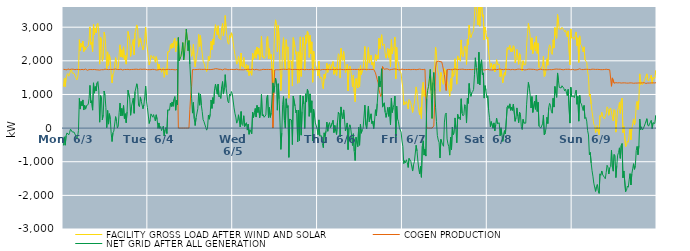
| Category | FACILITY GROSS LOAD AFTER WIND AND SOLAR | COGEN PRODUCTION | NET GRID AFTER ALL GENERATION |
|---|---|---|---|
|  Mon  6/3 | 1231 | 1748 | -517 |
|  Mon  6/3 | 1475 | 1734 | -259 |
|  Mon  6/3 | 1232 | 1740 | -508 |
|  Mon  6/3 | 1501 | 1728 | -227 |
|  Mon  6/3 | 1587 | 1730 | -143 |
|  Mon  6/3 | 1622 | 1760 | -138 |
|  Mon  6/3 | 1544 | 1745 | -201 |
|  Mon  6/3 | 1611 | 1739 | -128 |
|  Mon  6/3 | 1703 | 1734 | -31 |
|  Mon  6/3 | 1740 | 1752 | -12 |
|  Mon  6/3 | 1635 | 1751 | -116 |
|  Mon  6/3 | 1643 | 1750 | -107 |
|  Mon  6/3 | 1629 | 1748 | -119 |
|  Mon  6/3 | 1603 | 1737 | -134 |
|  Mon  6/3 | 1506 | 1740 | -234 |
|  Mon  6/3 | 1429 | 1746 | -317 |
|  Mon  6/3 | 1481 | 1740 | -259 |
|  Mon  6/3 | 1672 | 1744 | -72 |
|  Mon  6/3 | 2629 | 1744 | 885 |
|  Mon  6/3 | 2300 | 1735 | 565 |
|  Mon  6/3 | 2517 | 1725 | 792 |
|  Mon  6/3 | 2406 | 1745 | 661 |
|  Mon  6/3 | 2585 | 1748 | 837 |
|  Mon  6/3 | 2272 | 1735 | 537 |
|  Mon  6/3 | 2419 | 1744 | 675 |
|  Mon  6/3 | 2319 | 1755 | 564 |
|  Mon  6/3 | 2400 | 1734 | 666 |
|  Mon  6/3 | 2386 | 1720 | 666 |
|  Mon  6/3 | 2443 | 1741 | 702 |
|  Mon  6/3 | 2621 | 1739 | 882 |
|  Mon  6/3 | 3010 | 1741 | 1269 |
|  Mon  6/3 | 2487 | 1741 | 746 |
|  Mon  6/3 | 2557 | 1745 | 812 |
|  Mon  6/3 | 2273 | 1739 | 534 |
|  Mon  6/3 | 3085 | 1740 | 1345 |
|  Mon  6/3 | 2781 | 1743 | 1038 |
|  Mon  6/3 | 2978 | 1743 | 1235 |
|  Mon  6/3 | 2836 | 1734 | 1102 |
|  Mon  6/3 | 3083 | 1741 | 1342 |
|  Mon  6/3 | 3115 | 1731 | 1384 |
|  Mon  6/3 | 2851 | 1742 | 1109 |
|  Mon  6/3 | 1900 | 1725 | 175 |
|  Mon  6/3 | 2705 | 1736 | 969 |
|  Mon  6/3 | 2658 | 1737 | 921 |
|  Mon  6/3 | 1989 | 1744 | 245 |
|  Mon  6/3 | 2133 | 1734 | 399 |
|  Mon  6/3 | 2853 | 1751 | 1102 |
|  Mon  6/3 | 2725 | 1753 | 972 |
|  Mon  6/3 | 2364 | 1748 | 616 |
|  Mon  6/3 | 1758 | 1745 | 13 |
|  Mon  6/3 | 2266 | 1743 | 523 |
|  Mon  6/3 | 1857 | 1739 | 118 |
|  Mon  6/3 | 2182 | 1753 | 429 |
|  Mon  6/3 | 2016 | 1744 | 272 |
|  Mon  6/3 | 1598 | 1753 | -155 |
|  Mon  6/3 | 1344 | 1743 | -399 |
|  Mon  6/3 | 1600 | 1741 | -141 |
|  Mon  6/3 | 1657 | 1747 | -90 |
|  Mon  6/3 | 1654 | 1753 | -99 |
|  Mon  6/3 | 2096 | 1756 | 340 |
|  Mon  6/3 | 1939 | 1735 | 204 |
|  Mon  6/3 | 1743 | 1743 | 0 |
|  Mon  6/3 | 1785 | 1723 | 62 |
|  Mon  6/3 | 2194 | 1738 | 456 |
|  Mon  6/3 | 2476 | 1733 | 743 |
|  Mon  6/3 | 2113 | 1753 | 360 |
|  Mon  6/3 | 2329 | 1745 | 584 |
|  Mon  6/3 | 2102 | 1728 | 374 |
|  Mon  6/3 | 2416 | 1746 | 670 |
|  Mon  6/3 | 2026 | 1743 | 283 |
|  Mon  6/3 | 2156 | 1728 | 428 |
|  Mon  6/3 | 1901 | 1742 | 159 |
|  Mon  6/3 | 2227 | 1743 | 484 |
|  Mon  6/3 | 2874 | 1747 | 1127 |
|  Mon  6/3 | 2880 | 1743 | 1137 |
|  Mon  6/3 | 2612 | 1737 | 875 |
|  Mon  6/3 | 2132 | 1751 | 381 |
|  Mon  6/3 | 2391 | 1743 | 648 |
|  Mon  6/3 | 2374 | 1743 | 631 |
|  Mon  6/3 | 2633 | 1744 | 889 |
|  Mon  6/3 | 2177 | 1737 | 440 |
|  Mon  6/3 | 2833 | 1749 | 1084 |
|  Mon  6/3 | 2821 | 1740 | 1081 |
|  Mon  6/3 | 3067 | 1750 | 1317 |
|  Mon  6/3 | 2912 | 1743 | 1169 |
|  Mon  6/3 | 2407 | 1741 | 666 |
|  Mon  6/3 | 2378 | 1742 | 636 |
|  Mon  6/3 | 2681 | 1753 | 928 |
|  Mon  6/3 | 2537 | 1741 | 796 |
|  Mon  6/3 | 2548 | 1746 | 802 |
|  Mon  6/3 | 2321 | 1745 | 576 |
|  Mon  6/3 | 2440 | 1751 | 689 |
|  Mon  6/3 | 2669 | 1740 | 929 |
|  Mon  6/3 | 2997 | 1749 | 1248 |
|  Mon  6/3 | 2534 | 1745 | 789 |
|  Mon  6/3 | 2348 | 1737 | 611 |
|  Tue  6/4 | 2333 | 1742 | 591 |
|  Tue  6/4 | 1876 | 1738 | 138 |
|  Tue  6/4 | 1972 | 1738 | 234 |
|  Tue  6/4 | 2161 | 1738 | 423 |
|  Tue  6/4 | 2145 | 1738 | 407 |
|  Tue  6/4 | 2071 | 1747 | 324 |
|  Tue  6/4 | 2150 | 1748 | 402 |
|  Tue  6/4 | 2037 | 1742 | 295 |
|  Tue  6/4 | 1956 | 1742 | 214 |
|  Tue  6/4 | 2123 | 1728 | 395 |
|  Tue  6/4 | 2005 | 1751 | 254 |
|  Tue  6/4 | 1724 | 1733 | -9 |
|  Tue  6/4 | 1905 | 1752 | 153 |
|  Tue  6/4 | 1735 | 1746 | -11 |
|  Tue  6/4 | 1775 | 1729 | 46 |
|  Tue  6/4 | 1660 | 1735 | -75 |
|  Tue  6/4 | 1743 | 1749 | -6 |
|  Tue  6/4 | 1795 | 1740 | 55 |
|  Tue  6/4 | 1511 | 1743 | -232 |
|  Tue  6/4 | 1684 | 1735 | -51 |
|  Tue  6/4 | 1763 | 1747 | 16 |
|  Tue  6/4 | 1584 | 1745 | -161 |
|  Tue  6/4 | 2268 | 1726 | 542 |
|  Tue  6/4 | 2285 | 1746 | 539 |
|  Tue  6/4 | 2274 | 1742 | 532 |
|  Tue  6/4 | 2481 | 1740 | 741 |
|  Tue  6/4 | 2368 | 1726 | 642 |
|  Tue  6/4 | 2522 | 1745 | 777 |
|  Tue  6/4 | 2383 | 1736 | 647 |
|  Tue  6/4 | 2589 | 1736 | 853 |
|  Tue  6/4 | 2667 | 1731 | 936 |
|  Tue  6/4 | 2263 | 1732 | 531 |
|  Tue  6/4 | 2569 | 1745 | 824 |
|  Tue  6/4 | 2444 | 1748 | 696 |
|  Tue  6/4 | 2691 | 0 | 2691 |
|  Tue  6/4 | 2007 | 0 | 2007 |
|  Tue  6/4 | 2080 | 0 | 2080 |
|  Tue  6/4 | 2136 | 0 | 2136 |
|  Tue  6/4 | 2301 | 0 | 2301 |
|  Tue  6/4 | 2542 | 0 | 2542 |
|  Tue  6/4 | 2027 | 0 | 2027 |
|  Tue  6/4 | 2230 | 0 | 2230 |
|  Tue  6/4 | 2206 | 0 | 2206 |
|  Tue  6/4 | 2941 | 0 | 2941 |
|  Tue  6/4 | 2624 | 0 | 2624 |
|  Tue  6/4 | 2298 | 0 | 2298 |
|  Tue  6/4 | 2603 | 0 | 2603 |
|  Tue  6/4 | 2444 | 544 | 1900 |
|  Tue  6/4 | 2390 | 989 | 1401 |
|  Tue  6/4 | 2131 | 1242 | 889 |
|  Tue  6/4 | 2187 | 1742 | 445 |
|  Tue  6/4 | 2491 | 1728 | 763 |
|  Tue  6/4 | 2016 | 1737 | 279 |
|  Tue  6/4 | 1818 | 1741 | 77 |
|  Tue  6/4 | 2045 | 1741 | 304 |
|  Tue  6/4 | 2037 | 1729 | 308 |
|  Tue  6/4 | 2318 | 1744 | 574 |
|  Tue  6/4 | 2782 | 1735 | 1047 |
|  Tue  6/4 | 2430 | 1749 | 681 |
|  Tue  6/4 | 2749 | 1743 | 1006 |
|  Tue  6/4 | 2419 | 1746 | 673 |
|  Tue  6/4 | 2225 | 1736 | 489 |
|  Tue  6/4 | 1994 | 1744 | 250 |
|  Tue  6/4 | 1928 | 1737 | 191 |
|  Tue  6/4 | 1936 | 1748 | 188 |
|  Tue  6/4 | 1760 | 1740 | 20 |
|  Tue  6/4 | 1679 | 1740 | -61 |
|  Tue  6/4 | 1755 | 1751 | 4 |
|  Tue  6/4 | 2131 | 1742 | 389 |
|  Tue  6/4 | 2008 | 1744 | 264 |
|  Tue  6/4 | 2152 | 1740 | 412 |
|  Tue  6/4 | 2581 | 1745 | 836 |
|  Tue  6/4 | 2328 | 1743 | 585 |
|  Tue  6/4 | 2648 | 1742 | 906 |
|  Tue  6/4 | 2483 | 1751 | 732 |
|  Tue  6/4 | 2912 | 1742 | 1170 |
|  Tue  6/4 | 3075 | 1766 | 1309 |
|  Tue  6/4 | 2872 | 1739 | 1133 |
|  Tue  6/4 | 2766 | 1761 | 1005 |
|  Tue  6/4 | 3045 | 1737 | 1308 |
|  Tue  6/4 | 2679 | 1748 | 931 |
|  Tue  6/4 | 2694 | 1731 | 963 |
|  Tue  6/4 | 2629 | 1747 | 882 |
|  Tue  6/4 | 2968 | 1748 | 1220 |
|  Tue  6/4 | 3112 | 1729 | 1383 |
|  Tue  6/4 | 2744 | 1732 | 1012 |
|  Tue  6/4 | 2947 | 1755 | 1192 |
|  Tue  6/4 | 3347 | 1759 | 1588 |
|  Tue  6/4 | 2953 | 1753 | 1200 |
|  Tue  6/4 | 2950 | 1751 | 1199 |
|  Tue  6/4 | 2532 | 1735 | 797 |
|  Tue  6/4 | 2492 | 1741 | 751 |
|  Tue  6/4 | 2752 | 1739 | 1013 |
|  Tue  6/4 | 2680 | 1728 | 952 |
|  Tue  6/4 | 2833 | 1746 | 1087 |
|  Tue  6/4 | 2761 | 1742 | 1019 |
|  Wed  6/5 | 2770 | 1741 | 1029 |
|  Wed  6/5 | 2342 | 1740 | 602 |
|  Wed  6/5 | 2180 | 1740 | 440 |
|  Wed  6/5 | 2074 | 1747 | 327 |
|  Wed  6/5 | 1900 | 1753 | 147 |
|  Wed  6/5 | 1942 | 1742 | 200 |
|  Wed  6/5 | 2132 | 1737 | 395 |
|  Wed  6/5 | 1969 | 1752 | 217 |
|  Wed  6/5 | 1767 | 1735 | 32 |
|  Wed  6/5 | 2229 | 1737 | 492 |
|  Wed  6/5 | 1847 | 1734 | 113 |
|  Wed  6/5 | 1815 | 1739 | 76 |
|  Wed  6/5 | 2100 | 1733 | 367 |
|  Wed  6/5 | 1790 | 1745 | 45 |
|  Wed  6/5 | 1757 | 1740 | 17 |
|  Wed  6/5 | 1901 | 1743 | 158 |
|  Wed  6/5 | 1687 | 1747 | -60 |
|  Wed  6/5 | 1859 | 1743 | 116 |
|  Wed  6/5 | 1563 | 1748 | -185 |
|  Wed  6/5 | 1700 | 1746 | -46 |
|  Wed  6/5 | 1719 | 1739 | -20 |
|  Wed  6/5 | 1570 | 1739 | -169 |
|  Wed  6/5 | 2227 | 1753 | 474 |
|  Wed  6/5 | 2046 | 1731 | 315 |
|  Wed  6/5 | 2199 | 1733 | 466 |
|  Wed  6/5 | 2325 | 1741 | 584 |
|  Wed  6/5 | 2076 | 1748 | 328 |
|  Wed  6/5 | 2411 | 1736 | 675 |
|  Wed  6/5 | 2197 | 1734 | 463 |
|  Wed  6/5 | 2372 | 1750 | 622 |
|  Wed  6/5 | 2036 | 1727 | 309 |
|  Wed  6/5 | 2222 | 1750 | 472 |
|  Wed  6/5 | 2736 | 1734 | 1002 |
|  Wed  6/5 | 2109 | 1743 | 366 |
|  Wed  6/5 | 2149 | 1748 | 401 |
|  Wed  6/5 | 2067 | 1746 | 321 |
|  Wed  6/5 | 2044 | 1741 | 303 |
|  Wed  6/5 | 2131 | 1741 | 390 |
|  Wed  6/5 | 2659 | 1744 | 915 |
|  Wed  6/5 | 2721 | 1737 | 984 |
|  Wed  6/5 | 2059 | 1744 | 315 |
|  Wed  6/5 | 2361 | 1746 | 615 |
|  Wed  6/5 | 2057 | 1740 | 317 |
|  Wed  6/5 | 2188 | 1737 | 451 |
|  Wed  6/5 | 2184 | 1750 | 434 |
|  Wed  6/5 | 1343 | 0 | 1343 |
|  Wed  6/5 | 2202 | 1143 | 1059 |
|  Wed  6/5 | 2978 | 1729 | 1249 |
|  Wed  6/5 | 3218 | 1737 | 1481 |
|  Wed  6/5 | 3051 | 1737 | 1314 |
|  Wed  6/5 | 2264 | 1732 | 532 |
|  Wed  6/5 | 3053 | 1734 | 1319 |
|  Wed  6/5 | 2620 | 1749 | 871 |
|  Wed  6/5 | 1916 | 1738 | 178 |
|  Wed  6/5 | 1116 | 1749 | -633 |
|  Wed  6/5 | 1598 | 1746 | -148 |
|  Wed  6/5 | 2449 | 1742 | 707 |
|  Wed  6/5 | 2688 | 1749 | 939 |
|  Wed  6/5 | 1970 | 1742 | 228 |
|  Wed  6/5 | 1746 | 1746 | 0 |
|  Wed  6/5 | 2626 | 1753 | 873 |
|  Wed  6/5 | 2344 | 1742 | 602 |
|  Wed  6/5 | 2413 | 1746 | 667 |
|  Wed  6/5 | 888 | 1757 | -869 |
|  Wed  6/5 | 2003 | 1734 | 269 |
|  Wed  6/5 | 1997 | 1747 | 250 |
|  Wed  6/5 | 1993 | 1753 | 240 |
|  Wed  6/5 | 1250 | 1740 | -490 |
|  Wed  6/5 | 2689 | 1738 | 951 |
|  Wed  6/5 | 2703 | 1745 | 958 |
|  Wed  6/5 | 2411 | 1756 | 655 |
|  Wed  6/5 | 2197 | 1744 | 453 |
|  Wed  6/5 | 2270 | 1738 | 532 |
|  Wed  6/5 | 1333 | 1741 | -408 |
|  Wed  6/5 | 2266 | 1740 | 526 |
|  Wed  6/5 | 1364 | 1734 | -370 |
|  Wed  6/5 | 2713 | 1736 | 977 |
|  Wed  6/5 | 1536 | 1746 | -210 |
|  Wed  6/5 | 2245 | 1752 | 493 |
|  Wed  6/5 | 2702 | 1747 | 955 |
|  Wed  6/5 | 2447 | 1733 | 714 |
|  Wed  6/5 | 1723 | 1735 | -12 |
|  Wed  6/5 | 2765 | 1746 | 1019 |
|  Wed  6/5 | 2520 | 1746 | 774 |
|  Wed  6/5 | 2883 | 1730 | 1153 |
|  Wed  6/5 | 2797 | 1740 | 1057 |
|  Wed  6/5 | 2099 | 1751 | 348 |
|  Wed  6/5 | 2757 | 1740 | 1017 |
|  Wed  6/5 | 2211 | 1747 | 464 |
|  Wed  6/5 | 2565 | 1753 | 812 |
|  Wed  6/5 | 1363 | 1741 | -378 |
|  Wed  6/5 | 2292 | 1734 | 558 |
|  Wed  6/5 | 2103 | 1739 | 364 |
|  Wed  6/5 | 1892 | 1738 | 154 |
|  Wed  6/5 | 1913 | 1738 | 175 |
|  Wed  6/5 | 1722 | 1741 | -19 |
|  Thu  6/6 | 1549 | 1747 | -198 |
|  Thu  6/6 | 1987 | 1743 | 244 |
|  Thu  6/6 | 1490 | 1727 | -237 |
|  Thu  6/6 | 1473 | 1729 | -256 |
|  Thu  6/6 | 1504 | 1734 | -230 |
|  Thu  6/6 | 1281 | 1743 | -462 |
|  Thu  6/6 | 1169 | 1750 | -581 |
|  Thu  6/6 | 1602 | 1743 | -141 |
|  Thu  6/6 | 1476 | 1728 | -252 |
|  Thu  6/6 | 1646 | 1737 | -91 |
|  Thu  6/6 | 1928 | 1749 | 179 |
|  Thu  6/6 | 1654 | 1748 | -94 |
|  Thu  6/6 | 1847 | 1746 | 101 |
|  Thu  6/6 | 1903 | 1738 | 165 |
|  Thu  6/6 | 1741 | 1732 | 9 |
|  Thu  6/6 | 1763 | 1739 | 24 |
|  Thu  6/6 | 1901 | 1749 | 152 |
|  Thu  6/6 | 1981 | 1747 | 234 |
|  Thu  6/6 | 1598 | 1732 | -134 |
|  Thu  6/6 | 1813 | 1734 | 79 |
|  Thu  6/6 | 1661 | 1742 | -81 |
|  Thu  6/6 | 1559 | 1749 | -190 |
|  Thu  6/6 | 1920 | 1747 | 173 |
|  Thu  6/6 | 2211 | 1740 | 471 |
|  Thu  6/6 | 2158 | 1747 | 411 |
|  Thu  6/6 | 1487 | 1750 | -263 |
|  Thu  6/6 | 2373 | 1744 | 629 |
|  Thu  6/6 | 2119 | 1742 | 377 |
|  Thu  6/6 | 2013 | 1738 | 275 |
|  Thu  6/6 | 2279 | 1738 | 541 |
|  Thu  6/6 | 1993 | 1743 | 250 |
|  Thu  6/6 | 1653 | 1739 | -86 |
|  Thu  6/6 | 1765 | 1741 | 24 |
|  Thu  6/6 | 1895 | 1742 | 153 |
|  Thu  6/6 | 1104 | 1744 | -640 |
|  Thu  6/6 | 1751 | 1744 | 7 |
|  Thu  6/6 | 1842 | 1744 | 98 |
|  Thu  6/6 | 1732 | 1744 | -12 |
|  Thu  6/6 | 1511 | 1744 | -233 |
|  Thu  6/6 | 1226 | 1744 | -518 |
|  Thu  6/6 | 1576 | 1744 | -168 |
|  Thu  6/6 | 1054 | 1744 | -690 |
|  Thu  6/6 | 781 | 1744 | -963 |
|  Thu  6/6 | 1471 | 1744 | -273 |
|  Thu  6/6 | 1451 | 1744 | -293 |
|  Thu  6/6 | 1194 | 1744 | -550 |
|  Thu  6/6 | 1766 | 1746 | 20 |
|  Thu  6/6 | 1223 | 1734 | -511 |
|  Thu  6/6 | 1858 | 1746 | 112 |
|  Thu  6/6 | 1593 | 1746 | -153 |
|  Thu  6/6 | 1698 | 1746 | -48 |
|  Thu  6/6 | 1742 | 1746 | -4 |
|  Thu  6/6 | 1719 | 1746 | -27 |
|  Thu  6/6 | 2428 | 1746 | 682 |
|  Thu  6/6 | 1835 | 1737 | 98 |
|  Thu  6/6 | 1719 | 1744 | -25 |
|  Thu  6/6 | 1735 | 1739 | -4 |
|  Thu  6/6 | 2395 | 1745 | 650 |
|  Thu  6/6 | 1934 | 1743 | 191 |
|  Thu  6/6 | 1958 | 1744 | 214 |
|  Thu  6/6 | 2164 | 1740 | 424 |
|  Thu  6/6 | 1878 | 1743 | 135 |
|  Thu  6/6 | 1957 | 1747 | 210 |
|  Thu  6/6 | 1733 | 1747 | -14 |
|  Thu  6/6 | 1998 | 1759 | 239 |
|  Thu  6/6 | 2187 | 1641 | 546 |
|  Thu  6/6 | 2005 | 1639 | 366 |
|  Thu  6/6 | 2171 | 1440 | 731 |
|  Thu  6/6 | 2063 | 1344 | 719 |
|  Thu  6/6 | 2672 | 1132 | 1540 |
|  Thu  6/6 | 2359 | 1139 | 1220 |
|  Thu  6/6 | 2348 | 940 | 1408 |
|  Thu  6/6 | 2775 | 1010 | 1765 |
|  Thu  6/6 | 2457 | 1833 | 624 |
|  Thu  6/6 | 2449 | 1841 | 608 |
|  Thu  6/6 | 2496 | 1745 | 751 |
|  Thu  6/6 | 2206 | 1740 | 466 |
|  Thu  6/6 | 2079 | 1761 | 318 |
|  Thu  6/6 | 2196 | 1742 | 454 |
|  Thu  6/6 | 2372 | 1756 | 616 |
|  Thu  6/6 | 2101 | 1751 | 350 |
|  Thu  6/6 | 2348 | 1730 | 618 |
|  Thu  6/6 | 1826 | 1733 | 93 |
|  Thu  6/6 | 2629 | 1743 | 886 |
|  Thu  6/6 | 2208 | 1746 | 462 |
|  Thu  6/6 | 2365 | 1751 | 614 |
|  Thu  6/6 | 2427 | 1726 | 701 |
|  Thu  6/6 | 2708 | 1758 | 950 |
|  Thu  6/6 | 1464 | 1734 | -270 |
|  Thu  6/6 | 2401 | 1749 | 652 |
|  Thu  6/6 | 2014 | 1743 | 271 |
|  Thu  6/6 | 1929 | 1734 | 195 |
|  Thu  6/6 | 1753 | 1735 | 18 |
|  Thu  6/6 | 1675 | 1733 | -58 |
|  Thu  6/6 | 1626 | 1745 | -119 |
|  Thu  6/6 | 1370 | 1754 | -384 |
|  Fri  6/7 | 1195 | 1741 | -546 |
|  Fri  6/7 | 684 | 1739 | -1055 |
|  Fri  6/7 | 784 | 1752 | -968 |
|  Fri  6/7 | 708 | 1740 | -1032 |
|  Fri  6/7 | 790 | 1732 | -942 |
|  Fri  6/7 | 713 | 1741 | -1028 |
|  Fri  6/7 | 569 | 1739 | -1170 |
|  Fri  6/7 | 845 | 1744 | -899 |
|  Fri  6/7 | 811 | 1739 | -928 |
|  Fri  6/7 | 749 | 1737 | -988 |
|  Fri  6/7 | 773 | 1734 | -961 |
|  Fri  6/7 | 466 | 1743 | -1277 |
|  Fri  6/7 | 637 | 1731 | -1094 |
|  Fri  6/7 | 744 | 1744 | -1000 |
|  Fri  6/7 | 740 | 1752 | -1012 |
|  Fri  6/7 | 1224 | 1736 | -512 |
|  Fri  6/7 | 1053 | 1735 | -682 |
|  Fri  6/7 | 764 | 1744 | -980 |
|  Fri  6/7 | 518 | 1739 | -1221 |
|  Fri  6/7 | 391 | 1753 | -1362 |
|  Fri  6/7 | 607 | 1745 | -1138 |
|  Fri  6/7 | 279 | 1742 | -1463 |
|  Fri  6/7 | 1191 | 1728 | -537 |
|  Fri  6/7 | 1363 | 1739 | -376 |
|  Fri  6/7 | 945 | 1748 | -803 |
|  Fri  6/7 | 1123 | 1749 | -626 |
|  Fri  6/7 | 922 | 1754 | -832 |
|  Fri  6/7 | 880 | 0 | 880 |
|  Fri  6/7 | 1125 | 0 | 1125 |
|  Fri  6/7 | 1231 | 0 | 1231 |
|  Fri  6/7 | 1461 | 0 | 1461 |
|  Fri  6/7 | 1745 | 0 | 1745 |
|  Fri  6/7 | 1113 | 0 | 1113 |
|  Fri  6/7 | 287 | 0 | 287 |
|  Fri  6/7 | 1358 | 0 | 1358 |
|  Fri  6/7 | 1716 | 63 | 1653 |
|  Fri  6/7 | 1853 | 744 | 1109 |
|  Fri  6/7 | 2409 | 1788 | 621 |
|  Fri  6/7 | 2167 | 1972 | 195 |
|  Fri  6/7 | 1777 | 1997 | -220 |
|  Fri  6/7 | 1636 | 1990 | -354 |
|  Fri  6/7 | 1550 | 1980 | -430 |
|  Fri  6/7 | 1089 | 1977 | -888 |
|  Fri  6/7 | 1653 | 1988 | -335 |
|  Fri  6/7 | 1550 | 1967 | -417 |
|  Fri  6/7 | 1357 | 1851 | -494 |
|  Fri  6/7 | 1302 | 1843 | -541 |
|  Fri  6/7 | 1766 | 1587 | 179 |
|  Fri  6/7 | 1742 | 1338 | 404 |
|  Fri  6/7 | 1567 | 1118 | 449 |
|  Fri  6/7 | 1417 | 1739 | -322 |
|  Fri  6/7 | 1281 | 1750 | -469 |
|  Fri  6/7 | 1192 | 1745 | -553 |
|  Fri  6/7 | 946 | 1750 | -804 |
|  Fri  6/7 | 1473 | 1739 | -266 |
|  Fri  6/7 | 1101 | 1742 | -641 |
|  Fri  6/7 | 1764 | 1734 | 30 |
|  Fri  6/7 | 1532 | 1731 | -199 |
|  Fri  6/7 | 1608 | 1751 | -143 |
|  Fri  6/7 | 2060 | 1758 | 302 |
|  Fri  6/7 | 1725 | 1752 | -27 |
|  Fri  6/7 | 1305 | 1742 | -437 |
|  Fri  6/7 | 2146 | 1737 | 409 |
|  Fri  6/7 | 2028 | 1741 | 287 |
|  Fri  6/7 | 2072 | 1746 | 326 |
|  Fri  6/7 | 1989 | 1740 | 249 |
|  Fri  6/7 | 2621 | 1749 | 872 |
|  Fri  6/7 | 2185 | 1742 | 443 |
|  Fri  6/7 | 2117 | 1752 | 365 |
|  Fri  6/7 | 2133 | 1736 | 397 |
|  Fri  6/7 | 2437 | 1740 | 697 |
|  Fri  6/7 | 2386 | 1739 | 647 |
|  Fri  6/7 | 1890 | 1740 | 150 |
|  Fri  6/7 | 2636 | 1748 | 888 |
|  Fri  6/7 | 2476 | 1741 | 735 |
|  Fri  6/7 | 3064 | 1737 | 1327 |
|  Fri  6/7 | 2777 | 1742 | 1035 |
|  Fri  6/7 | 2687 | 1743 | 944 |
|  Fri  6/7 | 2790 | 1738 | 1052 |
|  Fri  6/7 | 2840 | 1753 | 1087 |
|  Fri  6/7 | 2892 | 1743 | 1149 |
|  Fri  6/7 | 3336 | 1749 | 1587 |
|  Fri  6/7 | 3841 | 1751 | 2090 |
|  Fri  6/7 | 3549 | 1738 | 1811 |
|  Fri  6/7 | 3570 | 1758 | 1812 |
|  Fri  6/7 | 3062 | 1746 | 1316 |
|  Fri  6/7 | 3998 | 1743 | 2255 |
|  Fri  6/7 | 3029 | 1748 | 1281 |
|  Fri  6/7 | 3638 | 1735 | 1903 |
|  Fri  6/7 | 3772 | 1743 | 2029 |
|  Fri  6/7 | 3319 | 1741 | 1578 |
|  Fri  6/7 | 3369 | 1728 | 1641 |
|  Fri  6/7 | 2618 | 1727 | 891 |
|  Fri  6/7 | 3006 | 1744 | 1262 |
|  Fri  6/7 | 2857 | 1738 | 1119 |
|  Fri  6/7 | 2644 | 1744 | 900 |
|  Sat  6/8 | 2706 | 1746 | 960 |
|  Sat  6/8 | 2274 | 1746 | 528 |
|  Sat  6/8 | 2041 | 1731 | 310 |
|  Sat  6/8 | 1779 | 1738 | 41 |
|  Sat  6/8 | 1925 | 1732 | 193 |
|  Sat  6/8 | 1928 | 1756 | 172 |
|  Sat  6/8 | 1724 | 1728 | -4 |
|  Sat  6/8 | 1901 | 1746 | 155 |
|  Sat  6/8 | 1668 | 1749 | -81 |
|  Sat  6/8 | 1841 | 1749 | 92 |
|  Sat  6/8 | 2035 | 1737 | 298 |
|  Sat  6/8 | 1885 | 1754 | 131 |
|  Sat  6/8 | 1891 | 1747 | 144 |
|  Sat  6/8 | 1903 | 1746 | 157 |
|  Sat  6/8 | 1524 | 1756 | -232 |
|  Sat  6/8 | 1751 | 1741 | 10 |
|  Sat  6/8 | 1538 | 1741 | -203 |
|  Sat  6/8 | 1343 | 1739 | -396 |
|  Sat  6/8 | 1343 | 1739 | -396 |
|  Sat  6/8 | 1657 | 1735 | -78 |
|  Sat  6/8 | 1574 | 1750 | -176 |
|  Sat  6/8 | 1591 | 1749 | -158 |
|  Sat  6/8 | 2369 | 1744 | 625 |
|  Sat  6/8 | 2405 | 1733 | 672 |
|  Sat  6/8 | 2333 | 1747 | 586 |
|  Sat  6/8 | 2460 | 1740 | 720 |
|  Sat  6/8 | 2262 | 1734 | 528 |
|  Sat  6/8 | 2361 | 1741 | 620 |
|  Sat  6/8 | 2269 | 1745 | 524 |
|  Sat  6/8 | 2449 | 1738 | 711 |
|  Sat  6/8 | 2418 | 1736 | 682 |
|  Sat  6/8 | 1937 | 1735 | 202 |
|  Sat  6/8 | 2044 | 1736 | 308 |
|  Sat  6/8 | 2337 | 1737 | 600 |
|  Sat  6/8 | 2106 | 1752 | 354 |
|  Sat  6/8 | 1894 | 1735 | 159 |
|  Sat  6/8 | 2221 | 1751 | 470 |
|  Sat  6/8 | 2141 | 1735 | 406 |
|  Sat  6/8 | 1784 | 1742 | 42 |
|  Sat  6/8 | 1701 | 1741 | -40 |
|  Sat  6/8 | 2001 | 1742 | 259 |
|  Sat  6/8 | 1884 | 1736 | 148 |
|  Sat  6/8 | 1864 | 1729 | 135 |
|  Sat  6/8 | 1885 | 1739 | 146 |
|  Sat  6/8 | 2448 | 1738 | 710 |
|  Sat  6/8 | 2815 | 1745 | 1070 |
|  Sat  6/8 | 3110 | 1751 | 1359 |
|  Sat  6/8 | 2941 | 1745 | 1196 |
|  Sat  6/8 | 2732 | 1750 | 982 |
|  Sat  6/8 | 2332 | 1735 | 597 |
|  Sat  6/8 | 2684 | 1747 | 937 |
|  Sat  6/8 | 2216 | 1751 | 465 |
|  Sat  6/8 | 2220 | 1746 | 474 |
|  Sat  6/8 | 2545 | 1740 | 805 |
|  Sat  6/8 | 2295 | 1736 | 559 |
|  Sat  6/8 | 2723 | 1741 | 982 |
|  Sat  6/8 | 2221 | 1727 | 494 |
|  Sat  6/8 | 2520 | 1751 | 769 |
|  Sat  6/8 | 1802 | 1743 | 59 |
|  Sat  6/8 | 1812 | 1740 | 72 |
|  Sat  6/8 | 1749 | 1751 | -2 |
|  Sat  6/8 | 1742 | 1730 | 12 |
|  Sat  6/8 | 1862 | 1737 | 125 |
|  Sat  6/8 | 2135 | 1750 | 385 |
|  Sat  6/8 | 1532 | 1736 | -204 |
|  Sat  6/8 | 1566 | 1718 | -152 |
|  Sat  6/8 | 1742 | 1734 | 8 |
|  Sat  6/8 | 2061 | 1739 | 322 |
|  Sat  6/8 | 1870 | 1735 | 135 |
|  Sat  6/8 | 2351 | 1740 | 611 |
|  Sat  6/8 | 2475 | 1740 | 735 |
|  Sat  6/8 | 2424 | 1746 | 678 |
|  Sat  6/8 | 2233 | 1736 | 497 |
|  Sat  6/8 | 2189 | 1745 | 444 |
|  Sat  6/8 | 2627 | 1741 | 886 |
|  Sat  6/8 | 2377 | 1752 | 625 |
|  Sat  6/8 | 2988 | 1751 | 1237 |
|  Sat  6/8 | 2769 | 1736 | 1033 |
|  Sat  6/8 | 2667 | 1755 | 912 |
|  Sat  6/8 | 3375 | 1736 | 1639 |
|  Sat  6/8 | 3158 | 1749 | 1409 |
|  Sat  6/8 | 2943 | 1734 | 1209 |
|  Sat  6/8 | 2969 | 1752 | 1217 |
|  Sat  6/8 | 2940 | 1748 | 1192 |
|  Sat  6/8 | 2996 | 1738 | 1258 |
|  Sat  6/8 | 3013 | 1746 | 1267 |
|  Sat  6/8 | 2920 | 1734 | 1186 |
|  Sat  6/8 | 2863 | 1757 | 1106 |
|  Sat  6/8 | 2907 | 1748 | 1159 |
|  Sat  6/8 | 2887 | 1739 | 1148 |
|  Sat  6/8 | 2710 | 1747 | 963 |
|  Sat  6/8 | 2889 | 1739 | 1150 |
|  Sat  6/8 | 2918 | 1750 | 1168 |
|  Sat  6/8 | 1881 | 1732 | 149 |
|  Sat  6/8 | 2949 | 1734 | 1215 |
|  Sat  6/8 | 2676 | 1739 | 937 |
|  Sun  6/9 | 2667 | 1747 | 920 |
|  Sun  6/9 | 2694 | 1737 | 957 |
|  Sun  6/9 | 2635 | 1731 | 904 |
|  Sun  6/9 | 2773 | 1742 | 1031 |
|  Sun  6/9 | 2859 | 1732 | 1127 |
|  Sun  6/9 | 2450 | 1742 | 708 |
|  Sun  6/9 | 2685 | 1742 | 943 |
|  Sun  6/9 | 1952 | 1746 | 206 |
|  Sun  6/9 | 2742 | 1763 | 979 |
|  Sun  6/9 | 2497 | 1742 | 755 |
|  Sun  6/9 | 2455 | 1741 | 714 |
|  Sun  6/9 | 2435 | 1737 | 698 |
|  Sun  6/9 | 2264 | 1739 | 525 |
|  Sun  6/9 | 2415 | 1743 | 672 |
|  Sun  6/9 | 2030 | 1747 | 283 |
|  Sun  6/9 | 2056 | 1739 | 317 |
|  Sun  6/9 | 1955 | 1748 | 207 |
|  Sun  6/9 | 1671 | 1747 | -76 |
|  Sun  6/9 | 1541 | 1745 | -204 |
|  Sun  6/9 | 946 | 1740 | -794 |
|  Sun  6/9 | 1013 | 1738 | -725 |
|  Sun  6/9 | 709 | 1747 | -1038 |
|  Sun  6/9 | 489 | 1752 | -1263 |
|  Sun  6/9 | 304 | 1733 | -1429 |
|  Sun  6/9 | 113 | 1750 | -1637 |
|  Sun  6/9 | 78 | 1736 | -1658 |
|  Sun  6/9 | -137 | 1744 | -1881 |
|  Sun  6/9 | -1 | 1738 | -1739 |
|  Sun  6/9 | 73 | 1747 | -1674 |
|  Sun  6/9 | -111 | 1745 | -1856 |
|  Sun  6/9 | -198 | 1743 | -1941 |
|  Sun  6/9 | 374 | 1734 | -1360 |
|  Sun  6/9 | 333 | 1737 | -1404 |
|  Sun  6/9 | 470 | 1745 | -1275 |
|  Sun  6/9 | 355 | 1738 | -1383 |
|  Sun  6/9 | 383 | 1741 | -1358 |
|  Sun  6/9 | 274 | 1741 | -1467 |
|  Sun  6/9 | 253 | 1759 | -1506 |
|  Sun  6/9 | 427 | 1749 | -1322 |
|  Sun  6/9 | 632 | 1736 | -1104 |
|  Sun  6/9 | 580 | 1740 | -1160 |
|  Sun  6/9 | 379 | 1744 | -1365 |
|  Sun  6/9 | 553 | 1735 | -1182 |
|  Sun  6/9 | 600 | 1746 | -1146 |
|  Sun  6/9 | 583 | 1243 | -660 |
|  Sun  6/9 | 336 | 1492 | -1156 |
|  Sun  6/9 | 214 | 1495 | -1281 |
|  Sun  6/9 | 551 | 1335 | -784 |
|  Sun  6/9 | 515 | 1338 | -823 |
|  Sun  6/9 | -121 | 1351 | -1472 |
|  Sun  6/9 | 235 | 1348 | -1113 |
|  Sun  6/9 | 540 | 1343 | -803 |
|  Sun  6/9 | 610 | 1336 | -726 |
|  Sun  6/9 | 761 | 1348 | -587 |
|  Sun  6/9 | 437 | 1336 | -899 |
|  Sun  6/9 | 817 | 1339 | -522 |
|  Sun  6/9 | 892 | 1350 | -458 |
|  Sun  6/9 | -133 | 1344 | -1477 |
|  Sun  6/9 | 59 | 1334 | -1275 |
|  Sun  6/9 | 87 | 1345 | -1258 |
|  Sun  6/9 | -554 | 1338 | -1892 |
|  Sun  6/9 | -513 | 1338 | -1851 |
|  Sun  6/9 | -388 | 1335 | -1723 |
|  Sun  6/9 | -421 | 1337 | -1758 |
|  Sun  6/9 | -204 | 1337 | -1541 |
|  Sun  6/9 | -10 | 1344 | -1354 |
|  Sun  6/9 | -347 | 1344 | -1691 |
|  Sun  6/9 | -24 | 1342 | -1366 |
|  Sun  6/9 | 123 | 1335 | -1212 |
|  Sun  6/9 | 274 | 1333 | -1059 |
|  Sun  6/9 | 106 | 1332 | -1226 |
|  Sun  6/9 | 221 | 1338 | -1117 |
|  Sun  6/9 | 679 | 1344 | -665 |
|  Sun  6/9 | 793 | 1338 | -545 |
|  Sun  6/9 | 550 | 1343 | -793 |
|  Sun  6/9 | 823 | 1343 | -520 |
|  Sun  6/9 | 1612 | 1344 | 268 |
|  Sun  6/9 | 1296 | 1340 | -44 |
|  Sun  6/9 | 1374 | 1337 | 37 |
|  Sun  6/9 | 1290 | 1345 | -55 |
|  Sun  6/9 | 1332 | 1349 | -17 |
|  Sun  6/9 | 1312 | 1349 | -37 |
|  Sun  6/9 | 1463 | 1341 | 122 |
|  Sun  6/9 | 1473 | 1328 | 145 |
|  Sun  6/9 | 1612 | 1333 | 279 |
|  Sun  6/9 | 1437 | 1339 | 98 |
|  Sun  6/9 | 1399 | 1342 | 57 |
|  Sun  6/9 | 1457 | 1339 | 118 |
|  Sun  6/9 | 1489 | 1345 | 144 |
|  Sun  6/9 | 1576 | 1343 | 233 |
|  Sun  6/9 | 1328 | 1346 | -18 |
|  Sun  6/9 | 1504 | 1345 | 159 |
|  Sun  6/9 | 1528 | 1350 | 178 |
|  Sun  6/9 | 1478 | 1342 | 136 |
|  Sun  6/9 | 1707 | 1337 | 370 |
|  Sun  6/9 | 1562 | 1353 | 209 |